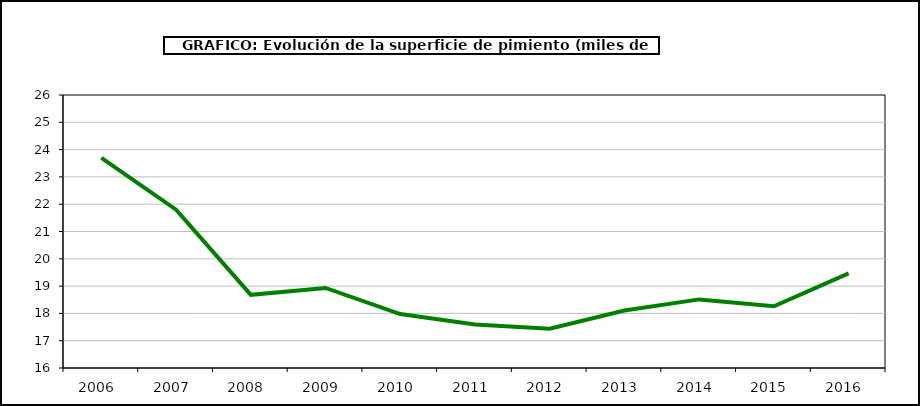
| Category | superficie |
|---|---|
| 2006.0 | 23.699 |
| 2007.0 | 21.798 |
| 2008.0 | 18.681 |
| 2009.0 | 18.931 |
| 2010.0 | 17.975 |
| 2011.0 | 17.595 |
| 2012.0 | 17.44 |
| 2013.0 | 18.108 |
| 2014.0 | 18.513 |
| 2015.0 | 18.263 |
| 2016.0 | 19.468 |